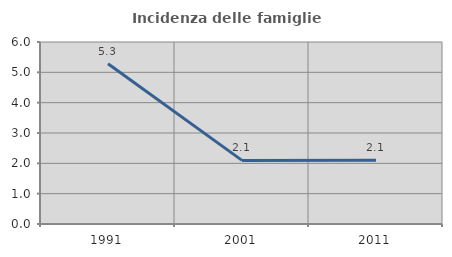
| Category | Incidenza delle famiglie numerose |
|---|---|
| 1991.0 | 5.281 |
| 2001.0 | 2.097 |
| 2011.0 | 2.099 |